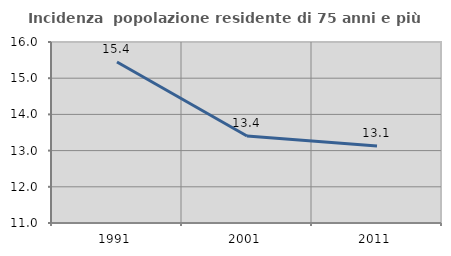
| Category | Incidenza  popolazione residente di 75 anni e più |
|---|---|
| 1991.0 | 15.448 |
| 2001.0 | 13.404 |
| 2011.0 | 13.129 |